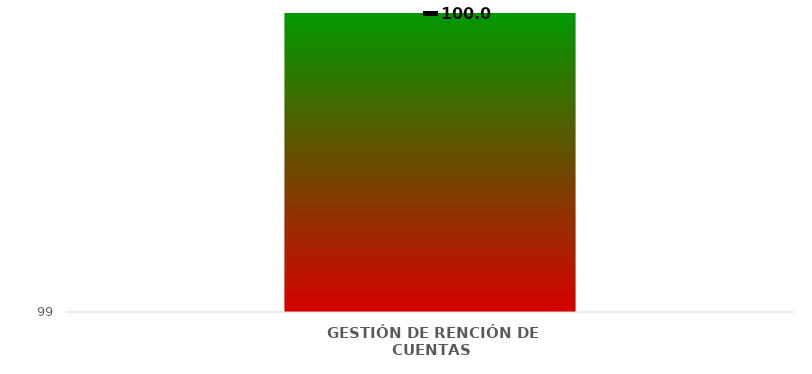
| Category | Niveles |
|---|---|
| GESTIÓN DE RENCIÓN DE CUENTAS | 100 |